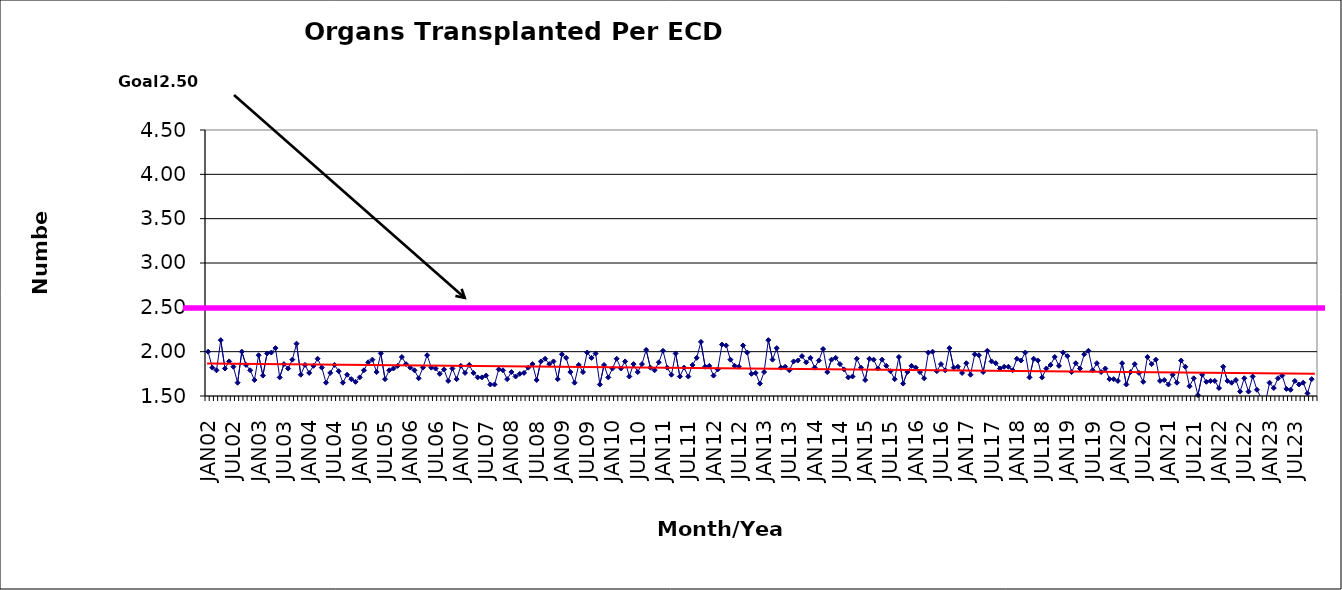
| Category | Series 0 |
|---|---|
| JAN02 | 2 |
| FEB02 | 1.82 |
| MAR02 | 1.79 |
| APR02 | 2.13 |
| MAY02 | 1.81 |
| JUN02 | 1.89 |
| JUL02 | 1.83 |
| AUG02 | 1.65 |
| SEP02 | 2 |
| OCT02 | 1.85 |
| NOV02 | 1.79 |
| DEC02 | 1.68 |
| JAN03 | 1.96 |
| FEB03 | 1.73 |
| MAR03 | 1.98 |
| APR03 | 1.99 |
| MAY03 | 2.04 |
| JUN03 | 1.71 |
| JUL03 | 1.86 |
| AUG03 | 1.81 |
| SEP03 | 1.91 |
| OCT03 | 2.09 |
| NOV03 | 1.74 |
| DEC03 | 1.85 |
| JAN04 | 1.76 |
| FEB04 | 1.84 |
| MAR04 | 1.92 |
| APR04 | 1.82 |
| MAY04 | 1.65 |
| JUN04 | 1.76 |
| JUL04 | 1.85 |
| AUG04 | 1.78 |
| SEP04 | 1.65 |
| OCT04 | 1.74 |
| NOV04 | 1.69 |
| DEC04 | 1.66 |
| JAN05 | 1.71 |
| FEB05 | 1.79 |
| MAR05 | 1.88 |
| APR05 | 1.91 |
| MAY05 | 1.77 |
| JUN05 | 1.98 |
| JUL05 | 1.69 |
| AUG05 | 1.79 |
| SEP05 | 1.81 |
| OCT05 | 1.84 |
| NOV05 | 1.94 |
| DEC05 | 1.86 |
| JAN06 | 1.82 |
| FEB06 | 1.79 |
| MAR06 | 1.7 |
| APR06 | 1.82 |
| MAY06 | 1.96 |
| JUN06 | 1.82 |
| JUL06 | 1.81 |
| AUG06 | 1.75 |
| SEP06 | 1.8 |
| OCT06 | 1.67 |
| NOV06 | 1.81 |
| DEC06 | 1.69 |
| JAN07 | 1.84 |
| FEB07 | 1.76 |
| MAR07 | 1.85 |
| APR07 | 1.76 |
| MAY07 | 1.71 |
| JUN07 | 1.71 |
| JUL07 | 1.73 |
| AUG07 | 1.63 |
| SEP07 | 1.63 |
| OCT07 | 1.8 |
| NOV07 | 1.79 |
| DEC07 | 1.69 |
| JAN08 | 1.77 |
| FEB08 | 1.72 |
| MAR08 | 1.75 |
| APR08 | 1.76 |
| MAY08 | 1.82 |
| JUN08 | 1.86 |
| JUL08 | 1.68 |
| AUG08 | 1.89 |
| SEP08 | 1.92 |
| OCT08 | 1.86 |
| NOV08 | 1.89 |
| DEC08 | 1.69 |
| JAN09 | 1.97 |
| FEB09 | 1.93 |
| MAR09 | 1.77 |
| APR09 | 1.65 |
| MAY09 | 1.85 |
| JUN09 | 1.77 |
| JUL09 | 1.99 |
| AUG09 | 1.93 |
| SEP09 | 1.98 |
| OCT09 | 1.63 |
| NOV09 | 1.85 |
| DEC09 | 1.71 |
| JAN10 | 1.81 |
| FEB10 | 1.92 |
| MAR10 | 1.81 |
| APR10 | 1.89 |
| MAY10 | 1.72 |
| JUN10 | 1.86 |
| JUL10 | 1.77 |
| AUG10 | 1.86 |
| SEP10 | 2.02 |
| OCT10 | 1.82 |
| NOV10 | 1.79 |
| DEC10 | 1.88 |
| JAN11 | 2.01 |
| FEB11 | 1.82 |
| MAR11 | 1.74 |
| APR11 | 1.98 |
| MAY11 | 1.72 |
| JUN11 | 1.82 |
| JUL11 | 1.72 |
| AUG11 | 1.85 |
| SEP11 | 1.93 |
| OCT11 | 2.11 |
| NOV11 | 1.83 |
| DEC11 | 1.84 |
| JAN12 | 1.73 |
| FEB12 | 1.8 |
| MAR12 | 2.08 |
| APR12 | 2.07 |
| MAY12 | 1.91 |
| JUN12 | 1.84 |
| JUL12 | 1.83 |
| AUG12 | 2.07 |
| SEP12 | 1.99 |
| OCT12 | 1.75 |
| NOV12 | 1.76 |
| DEC12 | 1.64 |
| JAN13 | 1.77 |
| FEB13 | 2.13 |
| MAR13 | 1.91 |
| APR13 | 2.04 |
| MAY13 | 1.82 |
| JUN13 | 1.83 |
| JUL13 | 1.79 |
| AUG13 | 1.89 |
| SEP13 | 1.9 |
| OCT13 | 1.95 |
| NOV13 | 1.88 |
| DEC13 | 1.93 |
| JAN14 | 1.82 |
| FEB14 | 1.9 |
| MAR14 | 2.03 |
| APR14 | 1.77 |
| MAY14 | 1.91 |
| JUN14 | 1.93 |
| JUL14 | 1.86 |
| AUG14 | 1.8 |
| SEP14 | 1.71 |
| OCT14 | 1.72 |
| NOV14 | 1.92 |
| DEC14 | 1.82 |
| JAN15 | 1.68 |
| FEB15 | 1.92 |
| MAR15 | 1.91 |
| APR15 | 1.81 |
| MAY15 | 1.91 |
| JUN15 | 1.84 |
| JUL15 | 1.78 |
| AUG15 | 1.69 |
| SEP15 | 1.94 |
| OCT15 | 1.64 |
| NOV15 | 1.77 |
| DEC15 | 1.84 |
| JAN16 | 1.82 |
| FEB16 | 1.77 |
| MAR16 | 1.7 |
| APR16 | 1.99 |
| MAY16 | 2 |
| JUN16 | 1.78 |
| JUL16 | 1.86 |
| AUG16 | 1.79 |
| SEP16 | 2.04 |
| OCT16 | 1.82 |
| NOV16 | 1.83 |
| DEC16 | 1.76 |
| JAN17 | 1.87 |
| FEB17 | 1.74 |
| MAR17 | 1.97 |
| APR17 | 1.96 |
| MAY17 | 1.77 |
| JUN17 | 2.01 |
| JUL17 | 1.89 |
| AUG17 | 1.87 |
| SEP17 | 1.81 |
| OCT17 | 1.83 |
| NOV17 | 1.83 |
| DEC17 | 1.79 |
| JAN18 | 1.92 |
| FEB18 | 1.9 |
| MAR18 | 1.99 |
| APR18 | 1.71 |
| MAY18 | 1.92 |
| JUN18 | 1.9 |
| JUL18 | 1.71 |
| AUG18 | 1.81 |
| SEP18 | 1.85 |
| OCT18 | 1.94 |
| NOV18 | 1.84 |
| DEC18 | 1.99 |
| JAN19 | 1.95 |
| FEB19 | 1.77 |
| MAR19 | 1.87 |
| APR19 | 1.81 |
| MAY19 | 1.97 |
| JUN19 | 2.01 |
| JUL19 | 1.79 |
| AUG19 | 1.87 |
| SEP19 | 1.77 |
| OCT19 | 1.81 |
| NOV19 | 1.69 |
| DEC19 | 1.69 |
| JAN20 | 1.67 |
| FEB20 | 1.87 |
| MAR20 | 1.63 |
| APR20 | 1.77 |
| MAY20 | 1.86 |
| JUN20 | 1.76 |
| JUL20 | 1.66 |
| AUG20 | 1.94 |
| SEP20 | 1.86 |
| OCT20 | 1.91 |
| NOV20 | 1.67 |
| DEC20 | 1.68 |
| JAN21 | 1.63 |
| FEB21 | 1.74 |
| MAR21 | 1.65 |
| APR21 | 1.9 |
| MAY21 | 1.83 |
| JUN21 | 1.61 |
| JUL21 | 1.7 |
| AUG21 | 1.51 |
| SEP21 | 1.74 |
| OCT21 | 1.66 |
| NOV21 | 1.67 |
| DEC21 | 1.67 |
| JAN22 | 1.59 |
| FEB22 | 1.83 |
| MAR22 | 1.67 |
| APR22 | 1.65 |
| MAY22 | 1.68 |
| JUN22 | 1.55 |
| JUL22 | 1.7 |
| AUG22 | 1.55 |
| SEP22 | 1.72 |
| OCT22 | 1.57 |
| NOV22 | 1.48 |
| DEC22 | 1.42 |
| JAN23 | 1.65 |
| FEB23 | 1.59 |
| MAR23 | 1.7 |
| APR23 | 1.73 |
| MAY23 | 1.58 |
| JUN23 | 1.57 |
| JUL23 | 1.67 |
| AUG23 | 1.63 |
| SEP23 | 1.65 |
| OCT23 | 1.53 |
| NOV23 | 1.69 |